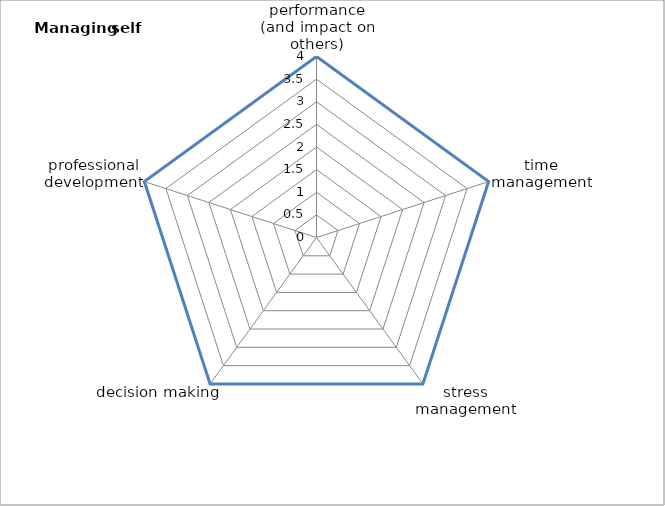
| Category | Series 0 | Series 1 |
|---|---|---|
| reflection on own performance (and impact on others) | 4 |  |
| time management | 4 |  |
| stress management | 4 |  |
| decision making | 4 |  |
| professional development | 4 |  |